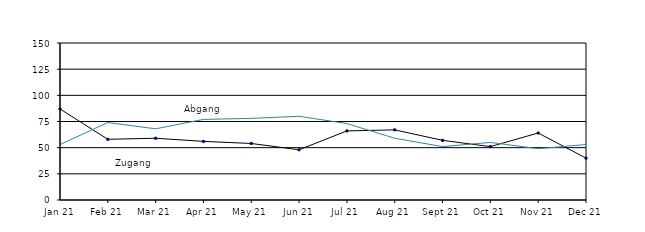
| Category | Zugang | Abgang |
|---|---|---|
| 2021-01-01 | 87 | 53 |
| 2021-02-01 | 58 | 74 |
| 2021-03-01 | 59 | 68 |
| 2021-04-01 | 56 | 77 |
| 2021-05-01 | 54 | 78 |
| 2021-06-01 | 48 | 80 |
| 2021-07-01 | 66 | 73 |
| 2021-08-01 | 67 | 59 |
| 2021-09-01 | 57 | 51 |
| 2021-10-01 | 51 | 55 |
| 2021-11-01 | 64 | 49 |
| 2021-12-01 | 40 | 53 |